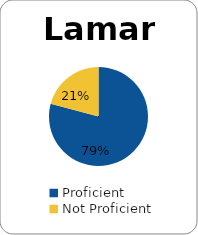
| Category | Series 0 |
|---|---|
| Proficient | 0.792 |
| Not Proficient | 0.208 |